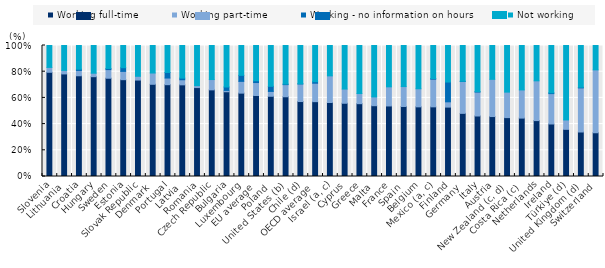
| Category | Working full-time | Working part-time | Working - no information on hours | Not working |
|---|---|---|---|---|
| Slovenia | 79.571 | 3.691 | 0 | 16.738 |
| Lithuania | 78.305 | 2.709 | 0 | 18.986 |
| Croatia | 76.895 | 4.079 | 0.93 | 18.096 |
| Hungary | 76.193 | 2.653 | 0 | 21.154 |
| Sweden | 75.018 | 6.588 | 0.872 | 17.522 |
| Estonia | 73.915 | 6.33 | 2.801 | 16.954 |
| Slovak Republic | 73.616 | 2.887 | 0 | 23.497 |
| Denmark | 70.39 | 8.605 | 0 | 21.005 |
| Portugal | 70.089 | 5.074 | 4.25 | 20.588 |
| Latvia | 69.968 | 3.881 | 1.231 | 24.92 |
| Romania | 67.88 | 1.485 | 0 | 30.635 |
| Czech Republic | 66.139 | 7.869 | 0 | 25.992 |
| Bulgaria | 64.686 | 1.011 | 2.615 | 31.688 |
| Luxembourg | 63.64 | 8.986 | 4.577 | 22.796 |
| EU average | 61.831 | 9.89 | 1.383 | 26.895 |
| Poland | 61.245 | 3.695 | 3.9 | 31.16 |
| United States (b) | 60.86 | 9.272 | 0.409 | 29.459 |
| Chile (d) | 57.22 | 13.456 | 0.064 | 29.26 |
| OECD average | 57.106 | 14.073 | 1.14 | 27.644 |
| Israel (a, c) | 56.5 | 20.323 | 0 | 23.177 |
| Cyprus | 55.913 | 10.833 | 0 | 33.254 |
| Greece | 55.591 | 7.735 | 0 | 36.673 |
| Malta | 54.041 | 6.73 | 0 | 39.229 |
| France | 53.844 | 14.61 | 0 | 31.546 |
| Spain | 53.444 | 15.205 | 0 | 31.35 |
| Belgium | 53.177 | 13.798 | 0 | 33.025 |
| Mexico (a, c) | 53.171 | 21.08 | 0.532 | 25.217 |
| Finland | 52.977 | 4.034 | 15.09 | 27.9 |
| Germany | 48.201 | 24.311 | 0.194 | 27.294 |
| Italy | 46.186 | 18.279 | 0.284 | 35.252 |
| Austria | 45.763 | 28.412 | 0 | 25.825 |
| New Zealand (c, d) | 44.954 | 19.45 | 0 | 35.596 |
| Costa Rica (c) | 44.579 | 21.502 | 0 | 33.919 |
| Netherlands | 42.678 | 30.356 | 0 | 26.966 |
| Ireland | 40.082 | 23.189 | 0.61 | 36.119 |
| Türkiye (d) | 35.998 | 7.174 | 0 | 56.828 |
| United Kingdom (d) | 33.964 | 33.664 | 0.516 | 31.856 |
| Switzerland | 33.009 | 47.448 | 0 | 18.391 |